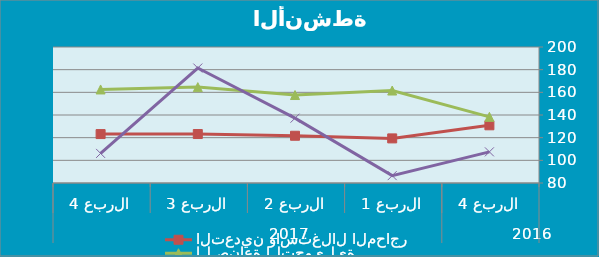
| Category | التعدين واستغلال المحاجر | الصناعة التحويلية | إمدادات الكهرباء |
|---|---|---|---|
| 0 | 130.91 | 138.37 | 107.49 |
| 1 | 119.36 | 161.6 | 86.5 |
| 2 | 121.69 | 157.62 | 137.2 |
| 3 | 123.2 | 164.6 | 181.44 |
| 4 | 123.18 | 162.54 | 106.12 |